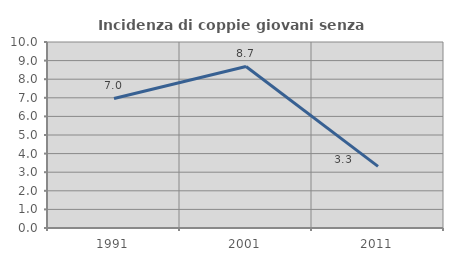
| Category | Incidenza di coppie giovani senza figli |
|---|---|
| 1991.0 | 6.965 |
| 2001.0 | 8.686 |
| 2011.0 | 3.314 |